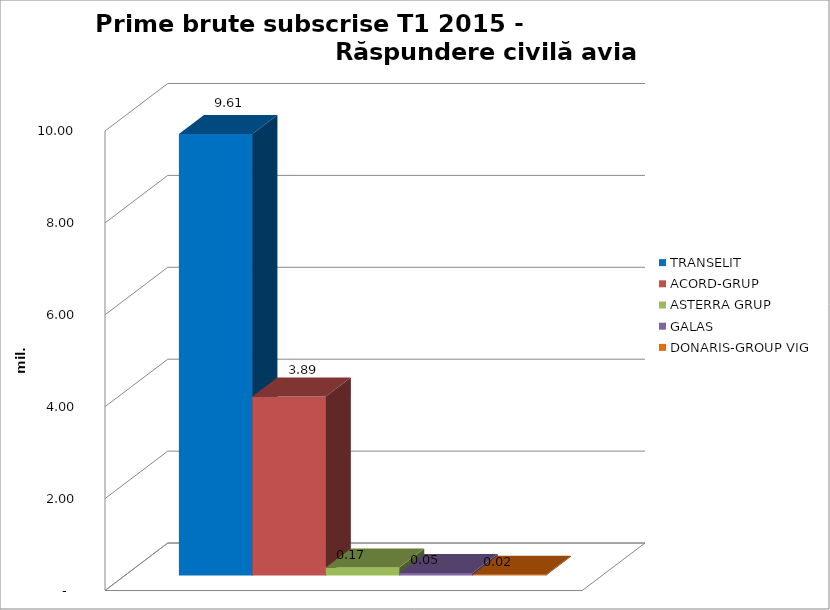
| Category | TRANSELIT  | ACORD-GRUP  | ASTERRA GRUP  | GALAS  | DONARIS-GROUP VIG |
|---|---|---|---|---|---|
| 0 | 9.607 | 3.895 | 0.172 | 0.054 | 0.017 |